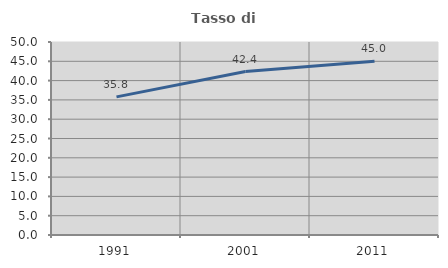
| Category | Tasso di occupazione   |
|---|---|
| 1991.0 | 35.782 |
| 2001.0 | 42.356 |
| 2011.0 | 45.014 |